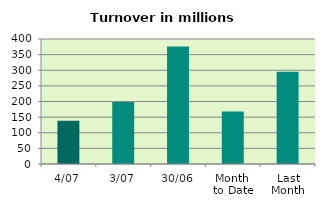
| Category | Series 0 |
|---|---|
| 4/07 | 138.084 |
| 3/07 | 198.029 |
| 30/06 | 375.837 |
| Month 
to Date | 168.056 |
| Last
Month | 295.453 |